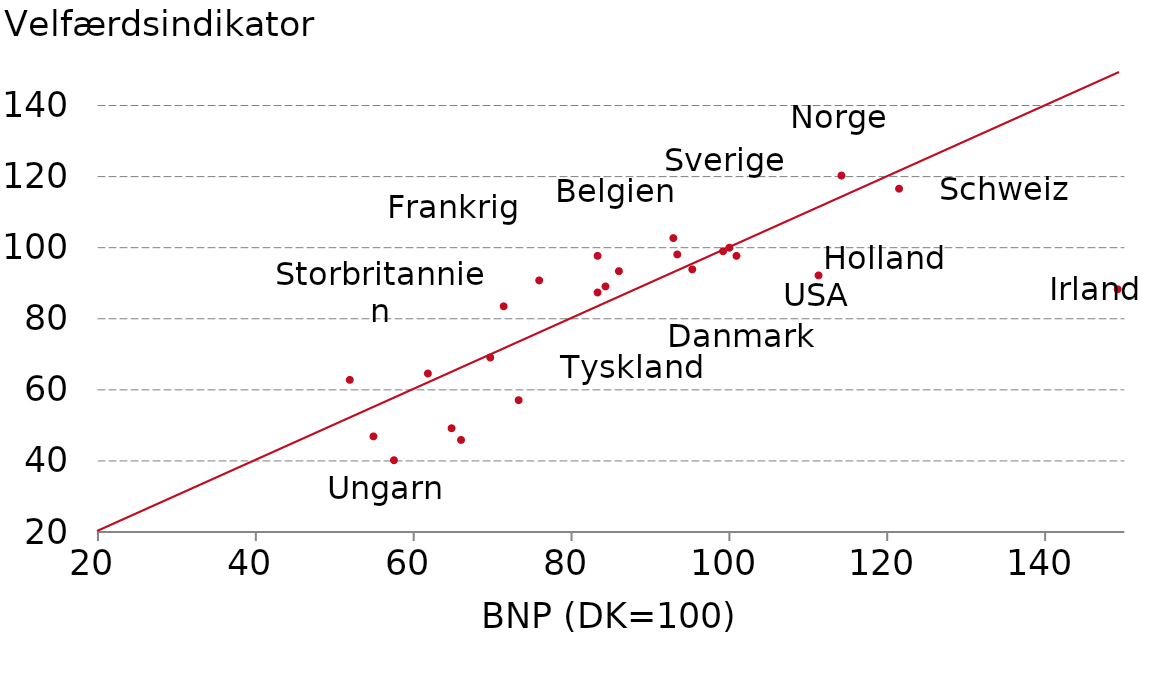
| Category |  Serie1 |
|---|---|
| 114.2 | 120.3 |
| 121.5 | 116.6 |
| 92.9 | 102.7 |
| 100.0 | 100 |
| 99.2 | 99 |
| 93.4 | 98.1 |
| 100.9 | 97.7 |
| 83.3 | 97.7 |
| 95.3 | 93.9 |
| 86.0 | 93.4 |
| 111.3 | 92.2 |
| 75.9 | 90.8 |
| 84.3 | 89.1 |
| 149.2 | 88.3 |
| 83.3 | 87.4 |
| 71.4 | 83.5 |
| 69.7 | 69.1 |
| 61.8 | 64.6 |
| 51.9 | 62.8 |
| 73.3 | 57.1 |
| 64.8 | 49.2 |
| 54.9 | 46.9 |
| 66.0 | 45.9 |
| 57.5 | 40.2 |